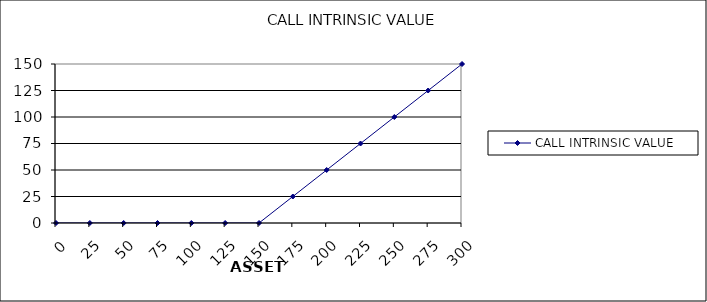
| Category | CALL INTRINSIC VALUE |
|---|---|
| 0.0 | 0 |
| 25.0 | 0 |
| 50.0 | 0 |
| 75.0 | 0 |
| 100.0 | 0 |
| 125.0 | 0 |
| 150.0 | 0 |
| 175.0 | 25 |
| 200.0 | 50 |
| 225.0 | 75 |
| 250.0 | 100 |
| 275.0 | 125 |
| 300.0 | 150 |